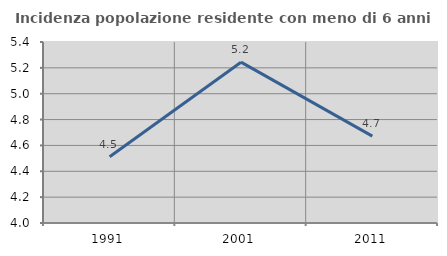
| Category | Incidenza popolazione residente con meno di 6 anni |
|---|---|
| 1991.0 | 4.512 |
| 2001.0 | 5.244 |
| 2011.0 | 4.672 |